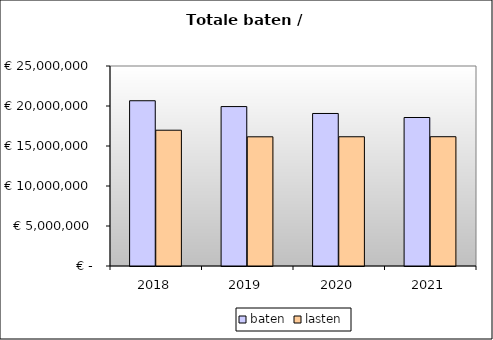
| Category | baten | lasten |
|---|---|---|
| 2018.0 | 20657833.906 | 16972869.2 |
| 2019.0 | 19928795.025 | 16149911.94 |
| 2020.0 | 19064748.871 | 16155696.18 |
| 2021.0 | 18561329.841 | 16161931.64 |